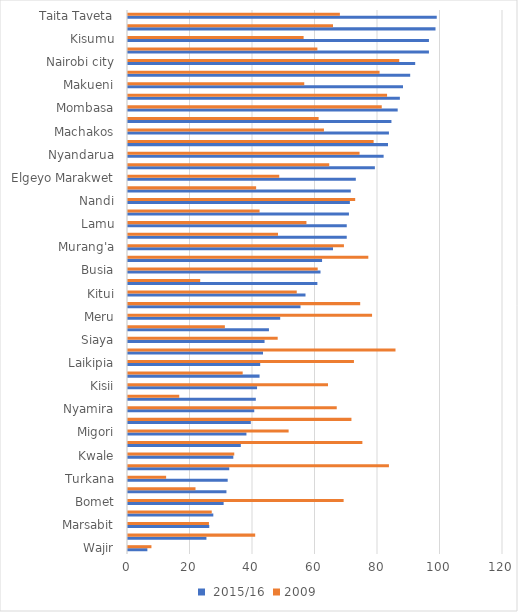
| Category |  2015/16 | 2009 |
|---|---|---|
| Wajir | 6.2 | 7.5 |
| Homabay | 25.1 | 40.7 |
| Marsabit | 26 | 25.9 |
| West Pokot | 27.3 | 26.8 |
| Bomet | 30.6 | 69 |
| Samburu | 31.5 | 21.6 |
| Turkana | 31.9 | 12.2 |
| Kakamega | 32.4 | 83.5 |
| Kwale | 33.7 | 34 |
| Trans Nzoia | 36.1 | 75 |
| Migori | 37.9 | 51.4 |
| Bungoma | 39.3 | 71.5 |
| Nyamira | 40.4 | 66.8 |
| Mandera | 40.9 | 16.4 |
| Kisii | 41.3 | 64 |
| Narok | 42.1 | 36.7 |
| Laikipia | 42.3 | 72.3 |
| Vihiga | 43.2 | 85.6 |
| Siaya | 43.7 | 47.9 |
| Garissa | 45.1 | 31 |
| Meru | 48.7 | 78.1 |
| Nyeri | 55.2 | 74.3 |
| Kitui | 56.8 | 54 |
| Tana River | 60.6 | 23.1 |
| Busia | 61.6 | 60.7 |
| Nakuru | 62.1 | 76.9 |
| Murang'a | 65.6 | 69.1 |
| Kilifi | 70 | 48 |
| Lamu | 70 | 57.1 |
| Isiolo | 70.7 | 42.1 |
| Nandi | 71 | 72.7 |
| Baringo | 71.3 | 41 |
| Elgeyo Marakwet | 72.9 | 48.4 |
| Kericho | 79 | 64.4 |
| Nyandarua | 81.8 | 74.1 |
| Uasin Gishu | 83.2 | 78.6 |
| Machakos | 83.5 | 62.7 |
| Kajiado | 84.3 | 61 |
| Mombasa | 86.3 | 81.2 |
| Kirinyaga | 87 | 82.9 |
| Makueni | 88 | 56.4 |
| Kiambu | 90.3 | 80.5 |
| Nairobi city | 91.9 | 86.8 |
| Tharaka-Nithi | 96.3 | 60.6 |
| Kisumu | 96.3 | 56.2 |
| Embu | 98.4 | 65.6 |
| Taita Taveta | 98.8 | 67.8 |